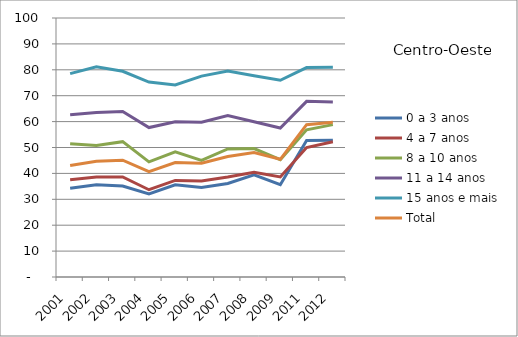
| Category | 0 a 3 anos | 4 a 7 anos | 8 a 10 anos | 11 a 14 anos | 15 anos e mais | Total |
|---|---|---|---|---|---|---|
| 2001.0 | 34.26 | 37.56 | 51.48 | 62.62 | 78.54 | 43.07 |
| 2002.0 | 35.58 | 38.61 | 50.77 | 63.51 | 81.17 | 44.73 |
| 2003.0 | 35.1 | 38.65 | 52.26 | 63.91 | 79.44 | 45.09 |
| 2004.0 | 32.08 | 33.69 | 44.47 | 57.69 | 75.28 | 40.69 |
| 2005.0 | 35.58 | 37.3 | 48.29 | 59.94 | 74.13 | 44.22 |
| 2006.0 | 34.54 | 37.1 | 45.05 | 59.78 | 77.57 | 43.91 |
| 2007.0 | 36.13 | 38.58 | 49.45 | 62.36 | 79.53 | 46.54 |
| 2008.0 | 39.47 | 40.48 | 49.57 | 59.97 | 77.69 | 48.07 |
| 2009.0 | 35.62 | 38.64 | 45.29 | 57.54 | 75.97 | 45.45 |
| 2011.0 | 52.71 | 49.99 | 56.84 | 67.82 | 80.86 | 58.8 |
| 2012.0 | 52.78 | 52.2 | 58.84 | 67.55 | 80.94 | 59.71 |